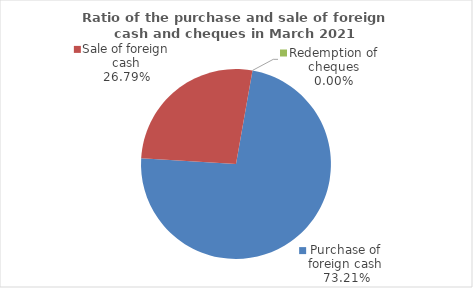
| Category | Series 0 |
|---|---|
| Purchase of foreign cash | 73.205 |
| Sale of foreign cash | 26.795 |
| Redemption of cheques | 0 |